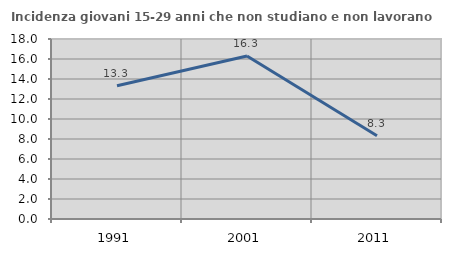
| Category | Incidenza giovani 15-29 anni che non studiano e non lavorano  |
|---|---|
| 1991.0 | 13.333 |
| 2001.0 | 16.304 |
| 2011.0 | 8.333 |